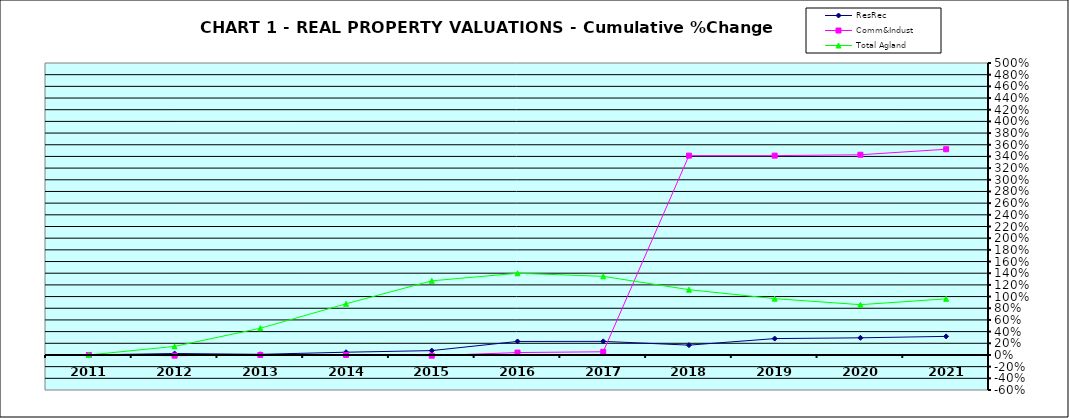
| Category | ResRec | Comm&Indust | Total Agland |
|---|---|---|---|
| 2011.0 | 0 | 0 | 0 |
| 2012.0 | 0.025 | -0.012 | 0.147 |
| 2013.0 | 0.011 | 0 | 0.458 |
| 2014.0 | 0.047 | 0 | 0.876 |
| 2015.0 | 0.075 | -0.013 | 1.269 |
| 2016.0 | 0.232 | 0.041 | 1.399 |
| 2017.0 | 0.233 | 0.055 | 1.346 |
| 2018.0 | 0.168 | 3.414 | 1.118 |
| 2019.0 | 0.28 | 3.414 | 0.965 |
| 2020.0 | 0.293 | 3.429 | 0.861 |
| 2021.0 | 0.318 | 3.523 | 0.961 |